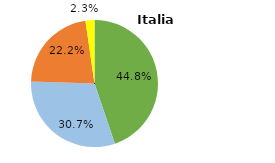
| Category | Italia |
|---|---|
| Industria | 0.448 |
| Terziario* | 0.307 |
| Domestico | 0.222 |
| Agricoltura | 0.023 |